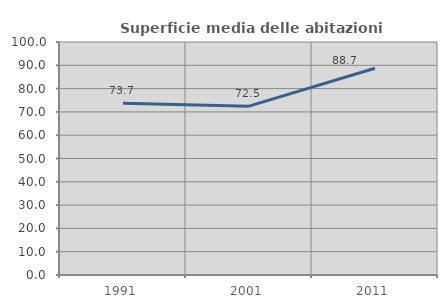
| Category | Superficie media delle abitazioni occupate |
|---|---|
| 1991.0 | 73.688 |
| 2001.0 | 72.452 |
| 2011.0 | 88.727 |